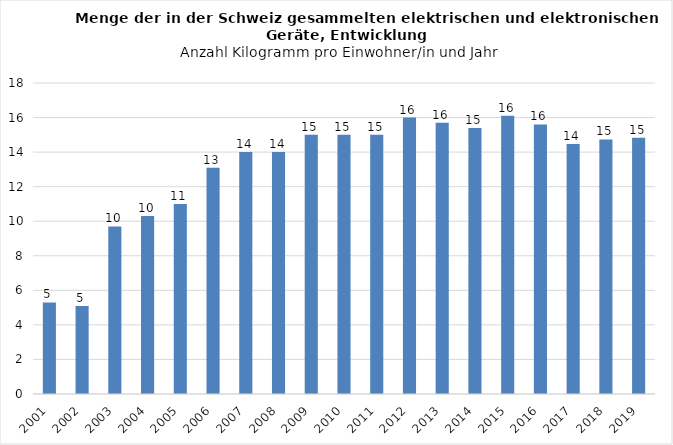
| Category | Series 0 |
|---|---|
| 2001.0 | 5.3 |
| 2002.0 | 5.1 |
| 2003.0 | 9.7 |
| 2004.0 | 10.3 |
| 2005.0 | 11 |
| 2006.0 | 13.1 |
| 2007.0 | 14 |
| 2008.0 | 14 |
| 2009.0 | 15 |
| 2010.0 | 15 |
| 2011.0 | 15 |
| 2012.0 | 16 |
| 2013.0 | 15.7 |
| 2014.0 | 15.4 |
| 2015.0 | 16.1 |
| 2016.0 | 15.6 |
| 2017.0 | 14.474 |
| 2018.0 | 14.735 |
| 2019.0 | 14.827 |